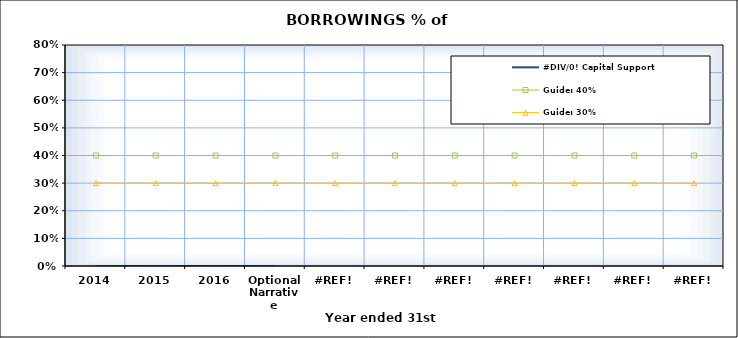
| Category | #DIV/0! Capital Support | Guide: 40% | Guide: 30% |
|---|---|---|---|
| 2014 |  | 0.4 | 0.3 |
| 2015 |  | 0.4 | 0.3 |
| 2016 |  | 0.4 | 0.3 |
| Optional Narrative |  | 0.4 | 0.3 |
| #REF! |  | 0.4 | 0.3 |
| #REF! |  | 0.4 | 0.3 |
| #REF! |  | 0.4 | 0.3 |
| #REF! |  | 0.4 | 0.3 |
| #REF! |  | 0.4 | 0.3 |
| #REF! |  | 0.4 | 0.3 |
| #REF! |  | 0.4 | 0.3 |